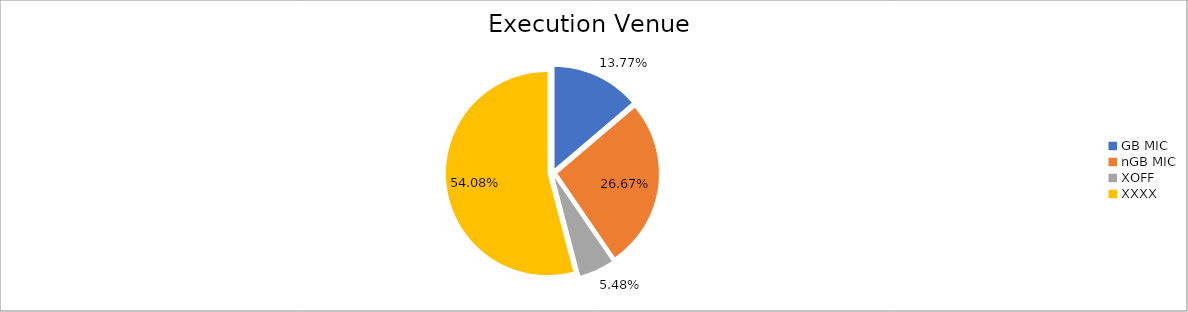
| Category | Series 0 |
|---|---|
| GB MIC | 1175997.595 |
| nGB MIC | 2276856.993 |
| XOFF | 467732.713 |
| XXXX | 4617703.321 |